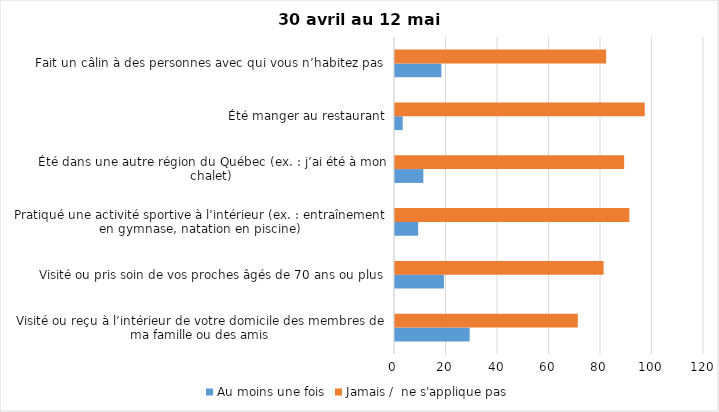
| Category | Au moins une fois | Jamais /  ne s'applique pas |
|---|---|---|
| Visité ou reçu à l’intérieur de votre domicile des membres de ma famille ou des amis | 29 | 71 |
| Visité ou pris soin de vos proches âgés de 70 ans ou plus | 19 | 81 |
| Pratiqué une activité sportive à l’intérieur (ex. : entraînement en gymnase, natation en piscine) | 9 | 91 |
| Été dans une autre région du Québec (ex. : j’ai été à mon chalet) | 11 | 89 |
| Été manger au restaurant | 3 | 97 |
| Fait un câlin à des personnes avec qui vous n’habitez pas | 18 | 82 |